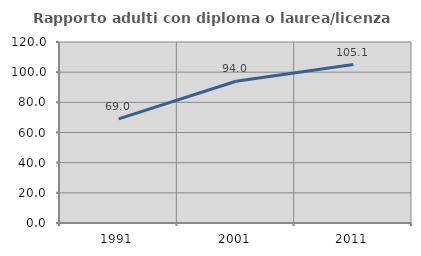
| Category | Rapporto adulti con diploma o laurea/licenza media  |
|---|---|
| 1991.0 | 69.011 |
| 2001.0 | 93.974 |
| 2011.0 | 105.063 |